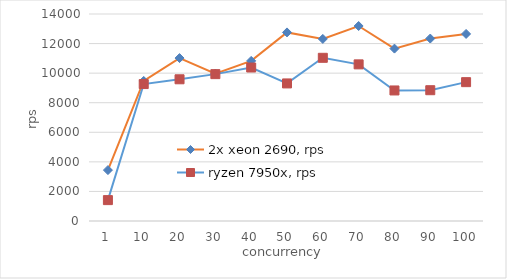
| Category | 2x xeon 2690, rps | ryzen 7950x, rps |
|---|---|---|
| 1 | 3442 | 1412 |
| 10 | 9471 | 9262 |
| 20 | 11019 | 9584 |
| 30 | 9971 | 9933 |
| 40 | 10828 | 10380 |
| 50 | 12755 | 9304 |
| 60 | 12314 | 11037 |
| 70 | 13188 | 10594 |
| 80 | 11660 | 8829 |
| 90 | 12340 | 8846 |
| 100 | 12652 | 9391 |